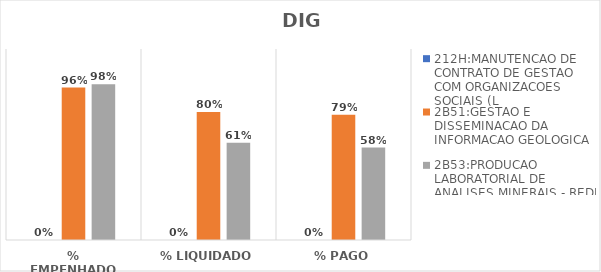
| Category | 212H:MANUTENCAO DE CONTRATO DE GESTAO COM ORGANIZACOES SOCIAIS (L | 2B51:GESTAO E DISSEMINACAO DA INFORMACAO GEOLOGICA | 2B53:PRODUCAO LABORATORIAL DE ANALISES MINERAIS - REDE LAMIN |
|---|---|---|---|
| % EMPENHADO | 0 | 0.958 | 0.979 |
| % LIQUIDADO | 0 | 0.805 | 0.611 |
| % PAGO | 0 | 0.787 | 0.581 |